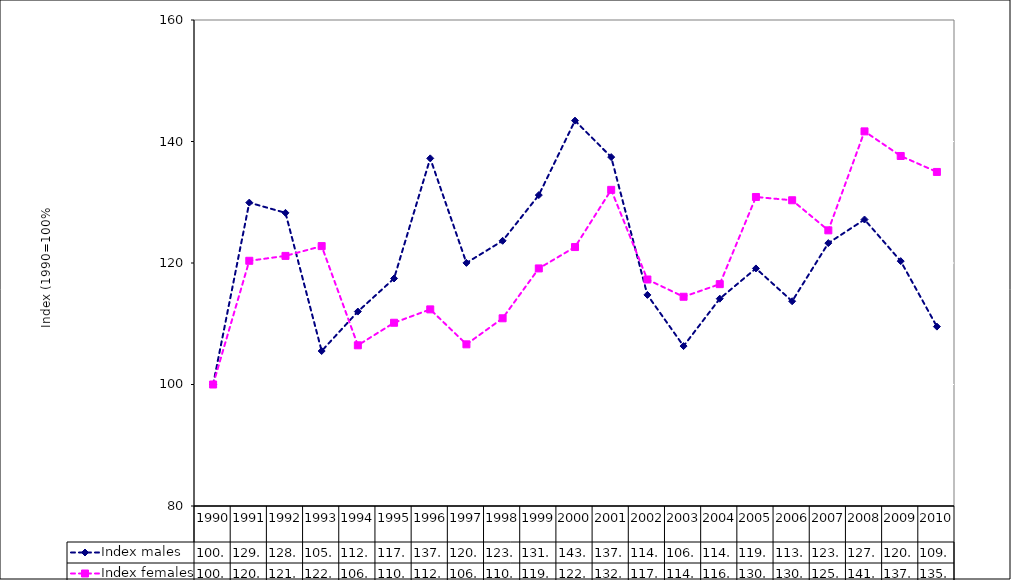
| Category | Index males | Index females |
|---|---|---|
| 1990.0 | 100 | 100 |
| 1991.0 | 129.94 | 120.363 |
| 1992.0 | 128.256 | 121.169 |
| 1993.0 | 105.511 | 122.782 |
| 1994.0 | 112.004 | 106.452 |
| 1995.0 | 117.456 | 110.162 |
| 1996.0 | 137.227 | 112.366 |
| 1997.0 | 120.014 | 106.612 |
| 1998.0 | 123.654 | 110.899 |
| 1999.0 | 131.179 | 119.105 |
| 2000.0 | 143.438 | 122.624 |
| 2001.0 | 137.432 | 132.04 |
| 2002.0 | 114.751 | 117.284 |
| 2003.0 | 106.324 | 114.442 |
| 2004.0 | 114.123 | 116.519 |
| 2005.0 | 119.107 | 130.868 |
| 2006.0 | 113.702 | 130.329 |
| 2007.0 | 123.276 | 125.375 |
| 2008.0 | 127.155 | 141.667 |
| 2009.0 | 120.307 | 137.616 |
| 2010.0 | 109.527 | 134.988 |